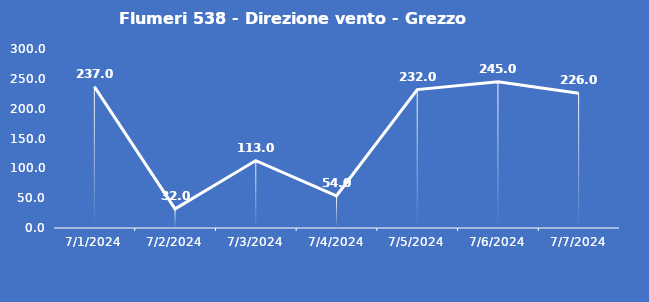
| Category | Flumeri 538 - Direzione vento - Grezzo (°N) |
|---|---|
| 7/1/24 | 237 |
| 7/2/24 | 32 |
| 7/3/24 | 113 |
| 7/4/24 | 54 |
| 7/5/24 | 232 |
| 7/6/24 | 245 |
| 7/7/24 | 226 |